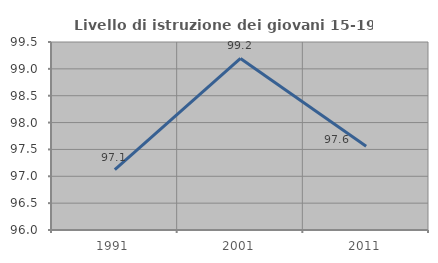
| Category | Livello di istruzione dei giovani 15-19 anni |
|---|---|
| 1991.0 | 97.122 |
| 2001.0 | 99.194 |
| 2011.0 | 97.561 |